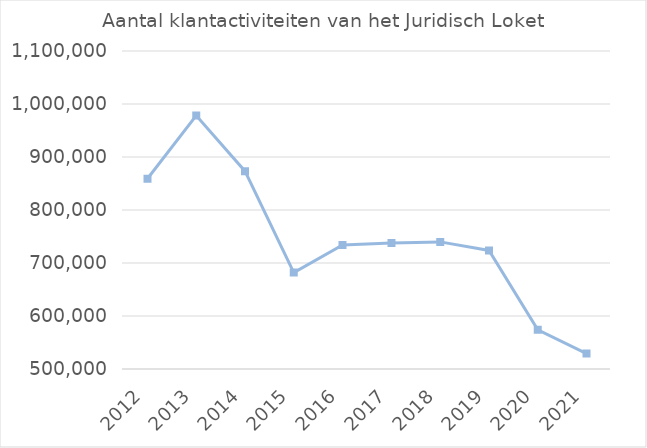
| Category | Series 0 | Series 1 |
|---|---|---|
| 2012.0 | 2012 | 858914 |
| 2013.0 | 2013 | 978267 |
| 2014.0 | 2014 | 873233 |
| 2015.0 | 2015 | 681993 |
| 2016.0 | 2016 | 733900 |
| 2017.0 | 2017 | 737583 |
| 2018.0 | 2018 | 739842 |
| 2019.0 | 2019 | 723706 |
| 2020.0 | 2020 | 574049 |
| 2021.0 | 2021 | 529110 |